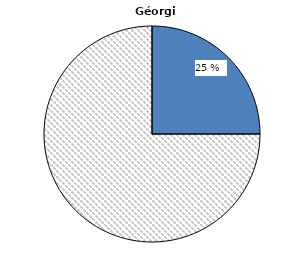
| Category | Géorgie |
|---|---|
|   Sans contrat de travail formel | 25 |
| Avec un contrat de travail formel | 75 |